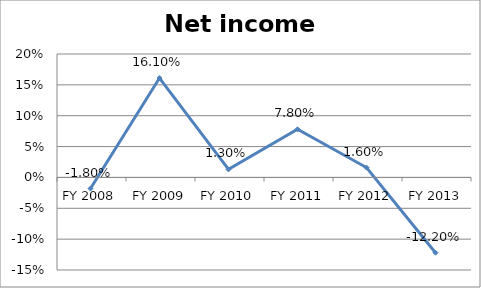
| Category | Net income ratio |
|---|---|
| FY 2013 | -0.122 |
| FY 2012 | 0.016 |
| FY 2011 | 0.078 |
| FY 2010 | 0.013 |
| FY 2009 | 0.161 |
| FY 2008 | -0.018 |